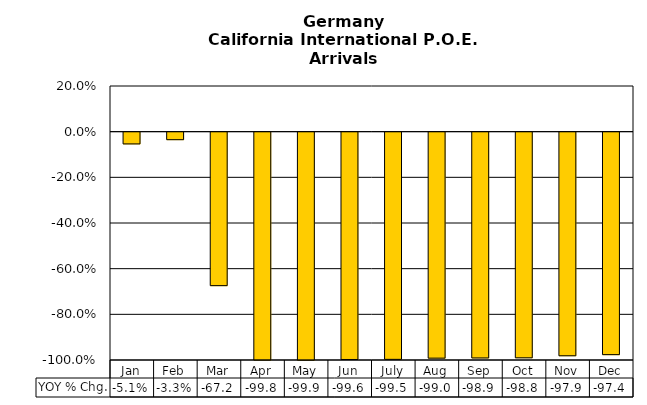
| Category | YOY % Chg. |
|---|---|
| Jan | -0.051 |
| Feb | -0.033 |
| Mar | -0.672 |
| Apr | -0.998 |
| May | -0.999 |
| Jun | -0.996 |
| July | -0.995 |
| Aug | -0.99 |
| Sep | -0.989 |
| Oct | -0.988 |
| Nov | -0.979 |
| Dec | -0.974 |